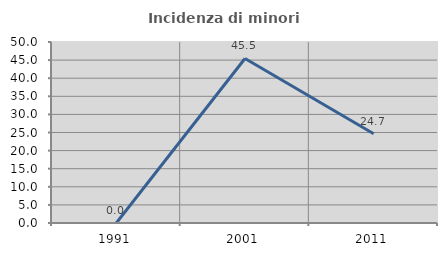
| Category | Incidenza di minori stranieri |
|---|---|
| 1991.0 | 0 |
| 2001.0 | 45.455 |
| 2011.0 | 24.675 |